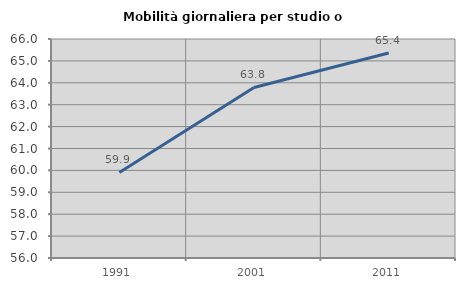
| Category | Mobilità giornaliera per studio o lavoro |
|---|---|
| 1991.0 | 59.908 |
| 2001.0 | 63.788 |
| 2011.0 | 65.358 |